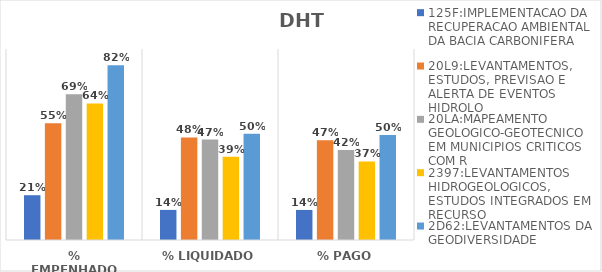
| Category | 125F:IMPLEMENTACAO DA RECUPERACAO AMBIENTAL DA BACIA CARBONIFERA | 20L9:LEVANTAMENTOS, ESTUDOS, PREVISAO E ALERTA DE EVENTOS HIDROLO | 20LA:MAPEAMENTO GEOLOGICO-GEOTECNICO EM MUNICIPIOS CRITICOS COM R | 2397:LEVANTAMENTOS HIDROGEOLOGICOS, ESTUDOS INTEGRADOS EM RECURSO | 2D62:LEVANTAMENTOS DA GEODIVERSIDADE |
|---|---|---|---|---|---|
| % EMPENHADO | 0.211 | 0.55 | 0.687 | 0.644 | 0.823 |
| % LIQUIDADO | 0.142 | 0.483 | 0.473 | 0.393 | 0.5 |
| % PAGO | 0.142 | 0.47 | 0.424 | 0.37 | 0.495 |